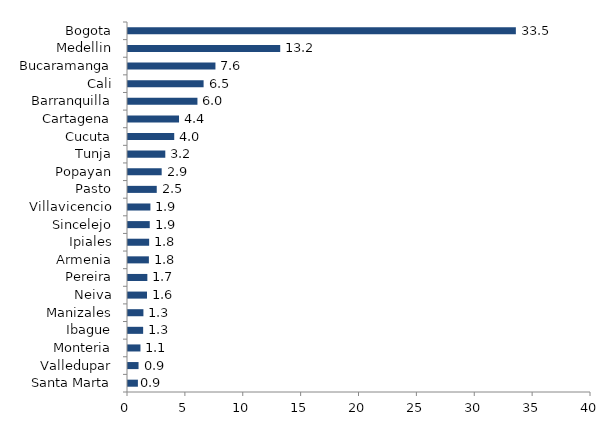
| Category | Series 0 |
|---|---|
| Santa Marta | 0.855 |
| Valledupar | 0.91 |
| Monteria | 1.076 |
| Ibague | 1.309 |
| Manizales | 1.332 |
| Neiva | 1.639 |
| Pereira | 1.672 |
| Armenia | 1.805 |
| Ipiales | 1.827 |
| Sincelejo | 1.879 |
| Villavicencio | 1.936 |
| Pasto | 2.484 |
| Popayan | 2.909 |
| Tunja | 3.222 |
| Cucuta | 3.994 |
| Cartagena | 4.408 |
| Barranquilla | 5.999 |
| Cali | 6.531 |
| Bucaramanga | 7.555 |
| Medellin | 13.15 |
| Bogota | 33.509 |